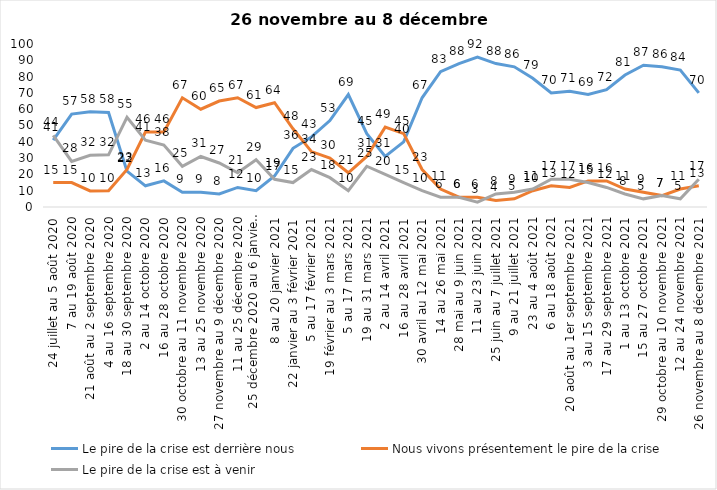
| Category | Le pire de la crise est derrière nous | Nous vivons présentement le pire de la crise | Le pire de la crise est à venir |
|---|---|---|---|
| 24 juillet au 5 août 2020 | 41 | 15 | 44 |
| 7 au 19 août 2020 | 57 | 15 | 28 |
| 21 août au 2 septembre 2020 | 58.39 | 9.84 | 31.77 |
| 4 au 16 septembre 2020 | 58 | 10 | 32 |
| 18 au 30 septembre 2020 | 22 | 23 | 55 |
| 2 au 14 octobre 2020 | 13 | 46 | 41 |
| 16 au 28 octobre 2020 | 16 | 46 | 38 |
| 30 octobre au 11 novembre 2020 | 9 | 67 | 25 |
| 13 au 25 novembre 2020 | 9 | 60 | 31 |
| 27 novembre au 9 décembre 2020 | 8 | 65 | 27 |
| 11 au 25 décembre 2020 | 12 | 67 | 21 |
| 25 décembre 2020 au 6 janvier 2021 | 10 | 61 | 29 |
| 8 au 20 janvier 2021 | 19 | 64 | 17 |
| 22 janvier au 3 février 2021 | 36 | 48 | 15 |
| 5 au 17 février 2021 | 43 | 34 | 23 |
| 19 février au 3 mars 2021 | 53 | 30 | 18 |
| 5 au 17 mars 2021 | 69 | 21 | 10 |
| 19 au 31 mars 2021 | 45 | 31 | 25 |
| 2 au 14 avril 2021 | 31 | 49 | 20 |
| 16 au 28 avril 2021 | 40 | 45 | 15 |
| 30 avril au 12 mai 2021 | 67 | 23 | 10 |
| 14 au 26 mai 2021 | 83 | 11 | 6 |
| 28 mai au 9 juin 2021 | 88 | 6 | 6 |
| 11 au 23 juin 2021 | 92 | 6 | 3 |
| 25 juin au 7 juillet 2021 | 88 | 4 | 8 |
| 9 au 21 juillet 2021 | 86 | 5 | 9 |
| 23 au 4 août 2021 | 79 | 10 | 11 |
| 6 au 18 août 2021 | 70 | 13 | 17 |
| 20 août au 1er septembre 2021 | 71 | 12 | 17 |
| 3 au 15 septembre 2021 | 69 | 16 | 15 |
| 17 au 29 septembre 2021 | 72 | 16 | 12 |
| 1 au 13 octobre 2021 | 81 | 11 | 8 |
| 15 au 27 octobre 2021 | 87 | 9 | 5 |
| 29 octobre au 10 novembre 2021 | 86 | 7 | 7 |
| 12 au 24 novembre 2021 | 84 | 11 | 5 |
| 26 novembre au 8 décembre 2021 | 70 | 13 | 17 |